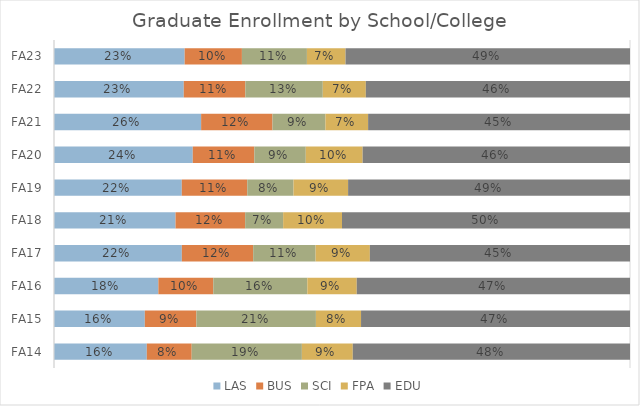
| Category | LAS | BUS | SCI | FPA | EDU |
|---|---|---|---|---|---|
| FA14 | 0.161 | 0.078 | 0.191 | 0.088 | 0.481 |
| FA15 | 0.158 | 0.09 | 0.208 | 0.078 | 0.467 |
| FA16 | 0.181 | 0.095 | 0.163 | 0.086 | 0.474 |
| FA17 | 0.222 | 0.124 | 0.108 | 0.094 | 0.452 |
| FA18 | 0.211 | 0.121 | 0.066 | 0.102 | 0.5 |
| FA19 | 0.222 | 0.114 | 0.08 | 0.095 | 0.489 |
| FA20 | 0.241 | 0.107 | 0.089 | 0.099 | 0.464 |
| FA21 | 0.255 | 0.124 | 0.092 | 0.074 | 0.455 |
| FA22 | 0.225 | 0.107 | 0.134 | 0.075 | 0.459 |
| FA23 | 0.227 | 0.099 | 0.113 | 0.067 | 0.494 |